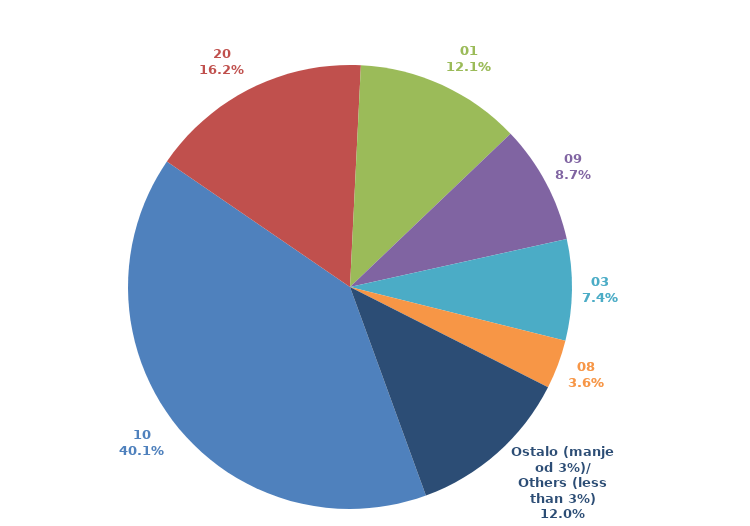
| Category | Series 0 |
|---|---|
| 10 | 0.401 |
| 20 | 0.162 |
| 01 | 0.121 |
| 09 | 0.087 |
| 03 | 0.074 |
| 08 | 0.036 |
| Ostalo (manje od 3%)/
Others (less than 3%) | 0.12 |